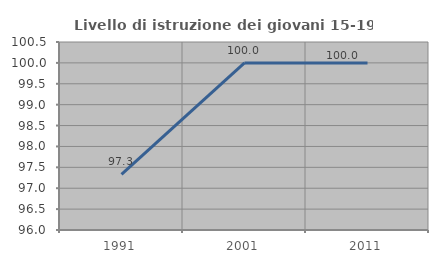
| Category | Livello di istruzione dei giovani 15-19 anni |
|---|---|
| 1991.0 | 97.333 |
| 2001.0 | 100 |
| 2011.0 | 100 |